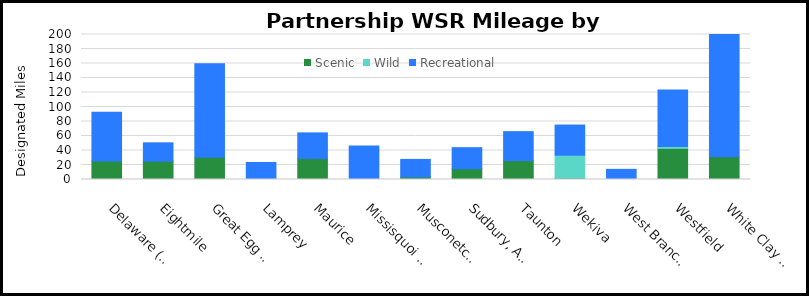
| Category | Scenic | Wild | Recreational |
|---|---|---|---|
| Delaware (Lower) | 25.4 | 0 | 67.3 |
| Eightmile | 25.3 | 0 | 25.3 |
| Great Egg Harbor | 30.6 | 0 | 129 |
| Lamprey | 0 | 0 | 23.5 |
| Maurice | 28.9 | 0 | 35.4 |
| Missisquoi and Trout | 0 | 0 | 46.1 |
| Musconetcong | 3.5 | 0 | 24.2 |
| Sudbury, Assabet and Concord | 14.9 | 0 | 29 |
| Taunton | 26 | 0 | 40 |
| Wekiva | 2.1 | 31.4 | 41.6 |
| West Branch Farmington | 0 | 0 | 14 |
| Westfield | 42.9 | 2.6 | 78.1 |
| White Clay Creek | 31.4 | 0 | 199 |